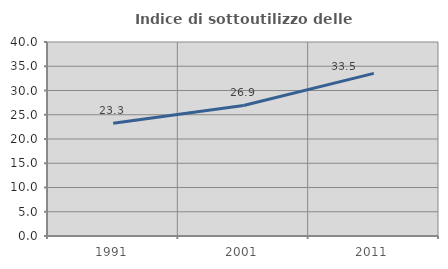
| Category | Indice di sottoutilizzo delle abitazioni  |
|---|---|
| 1991.0 | 23.256 |
| 2001.0 | 26.923 |
| 2011.0 | 33.528 |